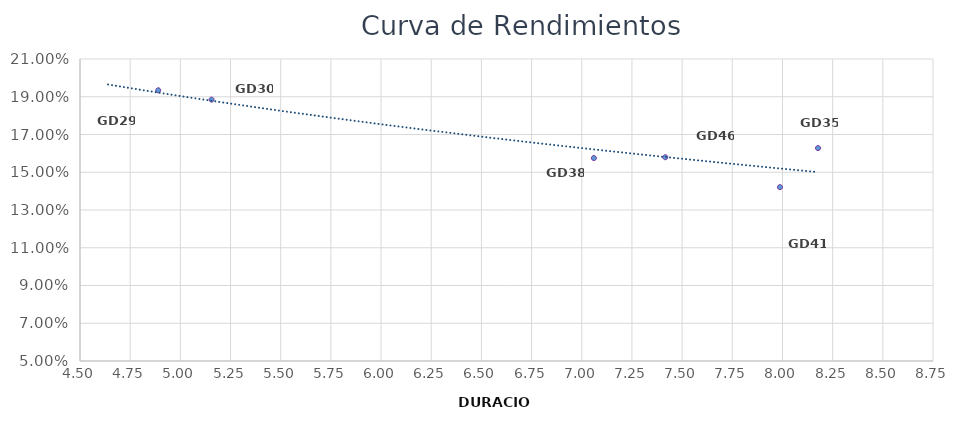
| Category | TIR N.A. |
|---|---|
| 4.889719907895018 | 0.193 |
| 5.1555090565823605 | 0.188 |
| 8.177079646034763 | 0.163 |
| 7.060390790463476 | 0.158 |
| 7.9875343728549915 | 0.142 |
| 7.41630491581966 | 0.158 |